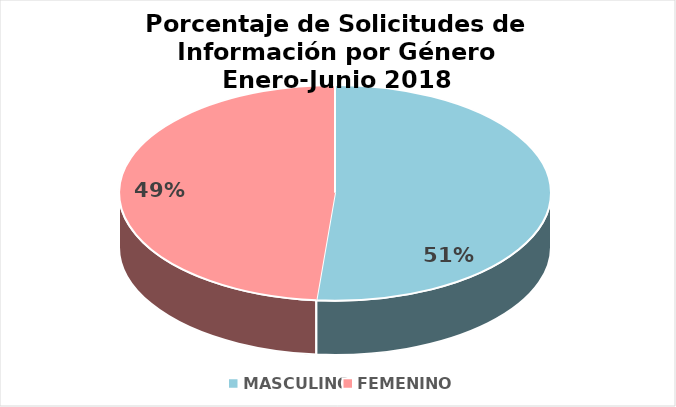
| Category | Series 0 |
|---|---|
| MASCULINO | 0.514 |
| FEMENINO | 0.486 |